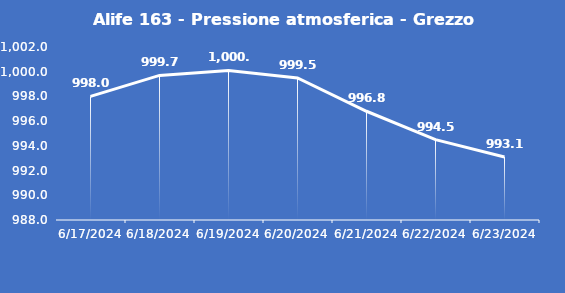
| Category | Alife 163 - Pressione atmosferica - Grezzo (hPa) |
|---|---|
| 6/17/24 | 998 |
| 6/18/24 | 999.7 |
| 6/19/24 | 1000.1 |
| 6/20/24 | 999.5 |
| 6/21/24 | 996.8 |
| 6/22/24 | 994.5 |
| 6/23/24 | 993.1 |